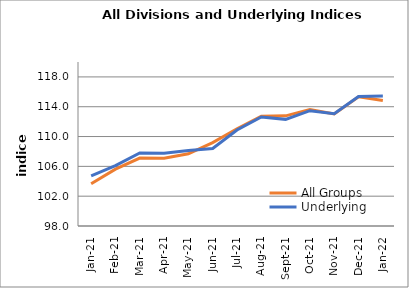
| Category | All Groups | Underlying |
|---|---|---|
| 2021-01-01 | 103.671 | 104.733 |
| 2021-02-01 | 105.627 | 106.099 |
| 2021-03-01 | 107.11 | 107.788 |
| 2021-04-01 | 107.082 | 107.772 |
| 2021-05-01 | 107.693 | 108.128 |
| 2021-06-01 | 109.193 | 108.399 |
| 2021-07-01 | 111.039 | 110.883 |
| 2021-08-01 | 112.735 | 112.633 |
| 2021-09-01 | 112.778 | 112.306 |
| 2021-10-01 | 113.609 | 113.469 |
| 2021-11-01 | 113.04 | 113.069 |
| 2021-12-01 | 115.332 | 115.373 |
| 2022-01-01 | 114.841 | 115.444 |